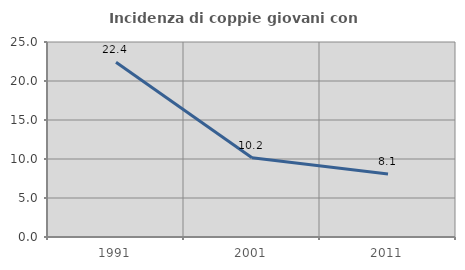
| Category | Incidenza di coppie giovani con figli |
|---|---|
| 1991.0 | 22.41 |
| 2001.0 | 10.166 |
| 2011.0 | 8.082 |